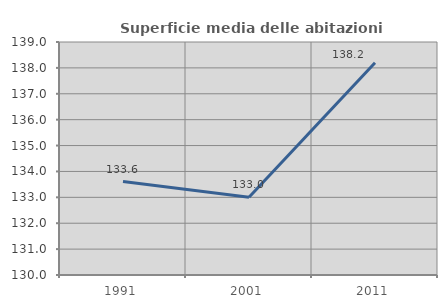
| Category | Superficie media delle abitazioni occupate |
|---|---|
| 1991.0 | 133.611 |
| 2001.0 | 133.007 |
| 2011.0 | 138.201 |